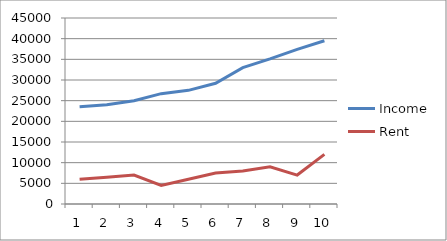
| Category | Income | Rent |
|---|---|---|
| 0 | 23500 | 6000 |
| 1 | 24000 | 6500 |
| 2 | 25000 | 7000 |
| 3 | 26700 | 4500 |
| 4 | 27500 | 6000 |
| 5 | 29200 | 7500 |
| 6 | 33000 | 8000 |
| 7 | 35100 | 9000 |
| 8 | 37400 | 7000 |
| 9 | 39500 | 12000 |